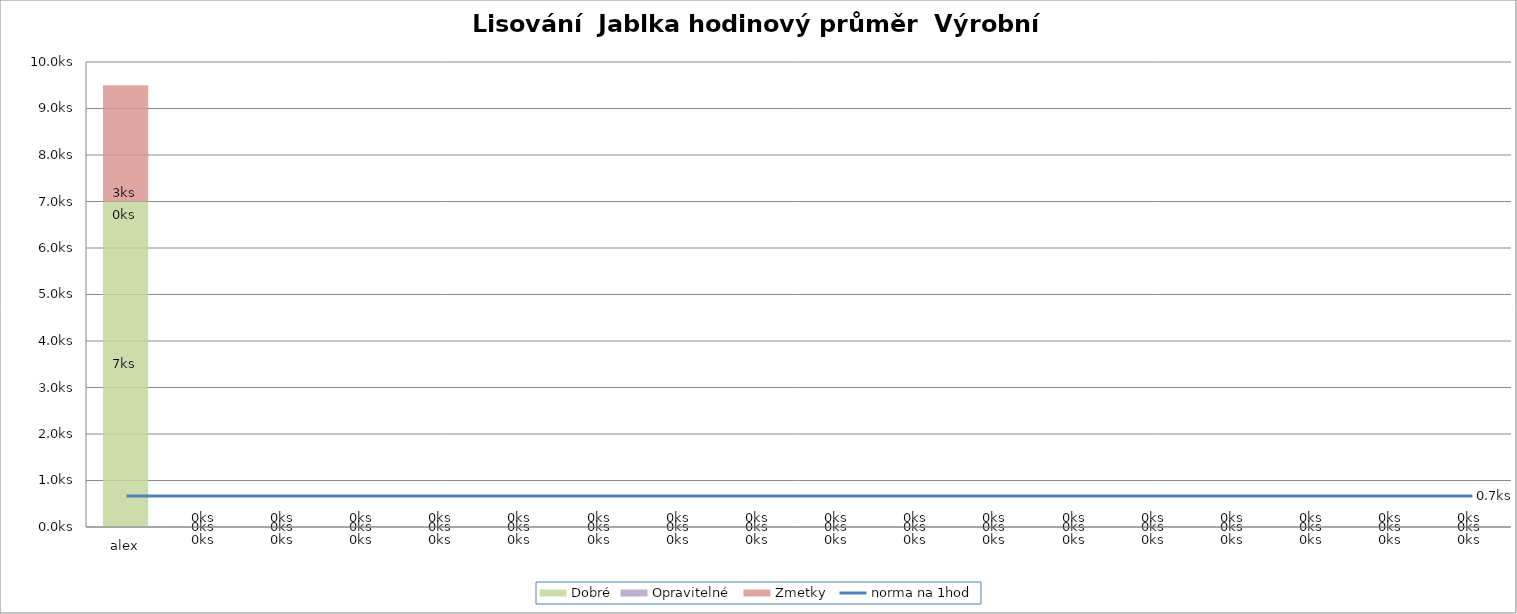
| Category | Dobré | Opravitelné  | Zmetky  |
|---|---|---|---|
| alex | 7 | 0 | 2.5 |